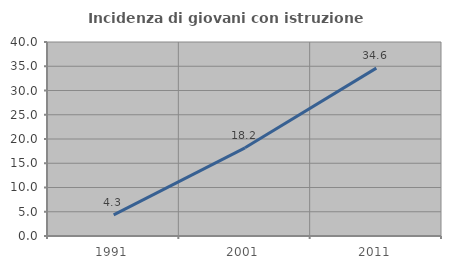
| Category | Incidenza di giovani con istruzione universitaria |
|---|---|
| 1991.0 | 4.348 |
| 2001.0 | 18.182 |
| 2011.0 | 34.615 |